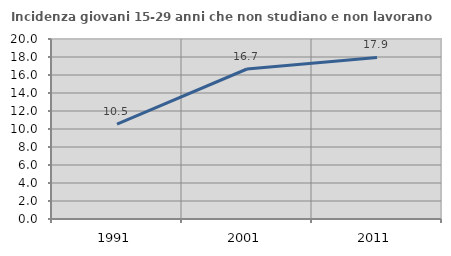
| Category | Incidenza giovani 15-29 anni che non studiano e non lavorano  |
|---|---|
| 1991.0 | 10.539 |
| 2001.0 | 16.667 |
| 2011.0 | 17.949 |